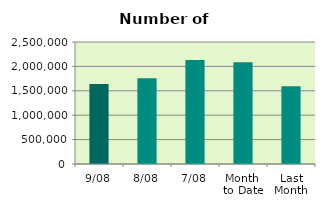
| Category | Series 0 |
|---|---|
| 9/08 | 1639910 |
| 8/08 | 1754904 |
| 7/08 | 2132564 |
| Month 
to Date | 2086424.571 |
| Last
Month | 1591495.826 |